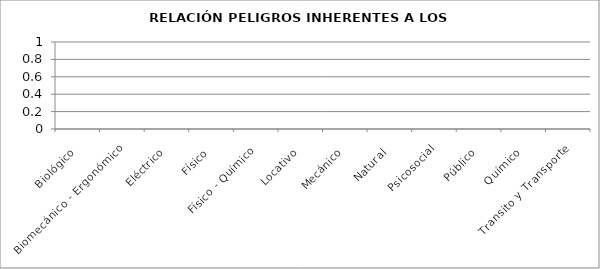
| Category | CANTIDAD |
|---|---|
| Biológico | 0 |
| Biomecánico - Ergonómico | 0 |
| Eléctrico | 0 |
| Físico | 0 |
| Físico - Químico | 0 |
| Locativo | 0 |
| Mecánico  | 0 |
| Natural | 0 |
| Psicosocial | 0 |
| Público | 0 |
| Químico | 0 |
| Transito y Transporte | 0 |